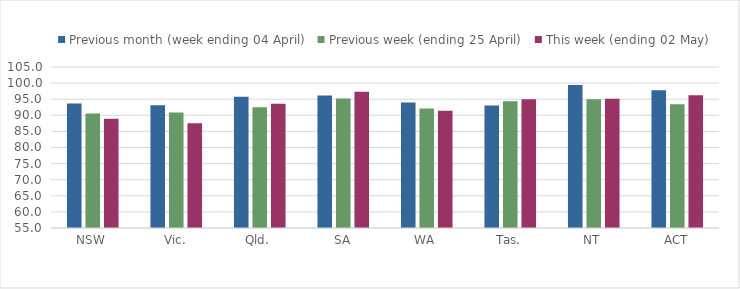
| Category | Previous month (week ending 04 April) | Previous week (ending 25 April) | This week (ending 02 May) |
|---|---|---|---|
| NSW | 93.638 | 90.544 | 88.941 |
| Vic. | 93.092 | 90.843 | 87.513 |
| Qld. | 95.744 | 92.51 | 93.58 |
| SA | 96.18 | 95.183 | 97.275 |
| WA | 93.952 | 92.124 | 91.392 |
| Tas. | 93.06 | 94.334 | 95.013 |
| NT | 99.375 | 95.015 | 95.103 |
| ACT | 97.774 | 93.47 | 96.196 |